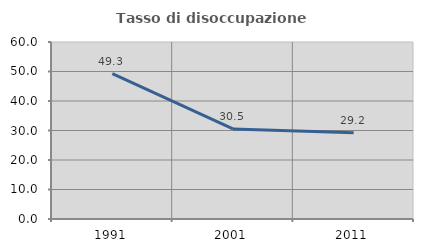
| Category | Tasso di disoccupazione giovanile  |
|---|---|
| 1991.0 | 49.312 |
| 2001.0 | 30.532 |
| 2011.0 | 29.22 |